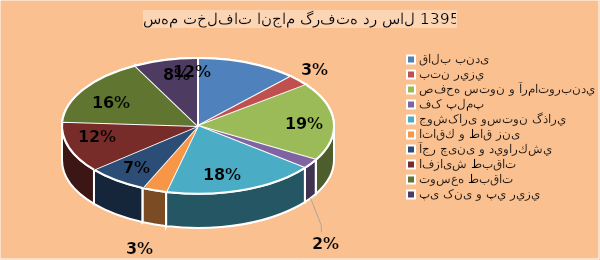
| Category | Series 0 |
|---|---|
| قالب بندی | 544 |
| بتن ريزي | 121 |
| صفحه ستون و آرماتوربندي | 846 |
| فک پلمپ | 104 |
| جوشکاری وستون گذاري  | 823 |
| اتاقك و طاق زنی | 132 |
| آجر چینی و ديواركشي  | 326 |
| افزایش طبقات | 550 |
| توسعه طبقات | 742 |
| پی کنی و پي ريزي  | 347 |